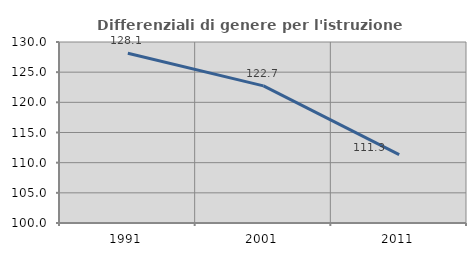
| Category | Differenziali di genere per l'istruzione superiore |
|---|---|
| 1991.0 | 128.133 |
| 2001.0 | 122.726 |
| 2011.0 | 111.335 |